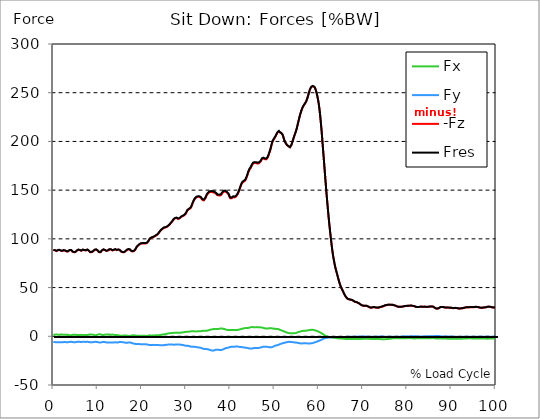
| Category |  Fx |  Fy |  -Fz |  Fres |
|---|---|---|---|---|
| 0.0 | 1.408 | -5.76 | 88.474 | 88.691 |
| 0.167348456675344 | 1.55 | -5.853 | 88.454 | 88.679 |
| 0.334696913350688 | 1.701 | -5.937 | 88.296 | 88.526 |
| 0.5020453700260321 | 1.839 | -6.049 | 87.878 | 88.12 |
| 0.669393826701376 | 1.946 | -6.173 | 87.444 | 87.696 |
| 0.83674228337672 | 1.825 | -6.201 | 87.62 | 87.871 |
| 1.0040907400520642 | 1.676 | -6.131 | 88.168 | 88.414 |
| 1.1621420602454444 | 1.561 | -6.025 | 88.717 | 88.954 |
| 1.3294905169207885 | 1.606 | -6.062 | 88.623 | 88.863 |
| 1.4968389735961325 | 1.676 | -6.101 | 88.382 | 88.628 |
| 1.6641874302714765 | 1.803 | -6.199 | 87.864 | 88.117 |
| 1.8315358869468206 | 1.916 | -6.334 | 87.353 | 87.617 |
| 1.9988843436221646 | 1.798 | -6.244 | 87.536 | 87.791 |
| 2.1662328002975086 | 1.658 | -6.104 | 87.871 | 88.115 |
| 2.333581256972853 | 1.53 | -5.922 | 88.278 | 88.507 |
| 2.5009297136481967 | 1.49 | -5.879 | 88.17 | 88.396 |
| 2.6682781703235405 | 1.498 | -5.937 | 87.878 | 88.107 |
| 2.8356266269988843 | 1.632 | -6.039 | 87.316 | 87.556 |
| 3.002975083674229 | 1.672 | -6.095 | 87.036 | 87.279 |
| 3.1703235403495724 | 1.593 | -6.07 | 86.97 | 87.209 |
| 3.337671997024917 | 1.49 | -6.048 | 87.148 | 87.383 |
| 3.4957233172182973 | 1.298 | -5.939 | 87.704 | 87.927 |
| 3.663071773893641 | 1.06 | -5.725 | 88.424 | 88.63 |
| 3.8304202305689854 | 0.971 | -5.603 | 88.649 | 88.847 |
| 3.997768687244329 | 1.015 | -5.607 | 88.474 | 88.673 |
| 4.165117143919673 | 1.247 | -5.717 | 87.768 | 87.977 |
| 4.332465600595017 | 1.511 | -5.905 | 86.878 | 87.105 |
| 4.499814057270361 | 1.693 | -6.076 | 86.191 | 86.437 |
| 4.667162513945706 | 1.663 | -6.104 | 86.224 | 86.471 |
| 4.834510970621049 | 1.608 | -6.013 | 86.352 | 86.591 |
| 5.001859427296393 | 1.69 | -6.034 | 86.444 | 86.684 |
| 5.169207883971737 | 1.556 | -5.939 | 86.976 | 87.206 |
| 5.336556340647081 | 1.329 | -5.776 | 87.956 | 88.172 |
| 5.503904797322425 | 1.3 | -5.669 | 88.561 | 88.77 |
| 5.671253253997769 | 1.298 | -5.642 | 88.84 | 89.046 |
| 5.82930457419115 | 1.312 | -5.648 | 88.819 | 89.025 |
| 5.996653030866494 | 1.399 | -5.743 | 88.3 | 88.514 |
| 6.164001487541838 | 1.515 | -5.905 | 87.666 | 87.894 |
| 6.331349944217181 | 1.486 | -5.945 | 87.774 | 88.003 |
| 6.498698400892526 | 1.323 | -5.822 | 88.245 | 88.462 |
| 6.66604685756787 | 1.111 | -5.624 | 88.825 | 89.026 |
| 6.833395314243213 | 1.233 | -5.651 | 88.755 | 88.958 |
| 7.000743770918558 | 1.403 | -5.719 | 88.378 | 88.588 |
| 7.168092227593902 | 1.473 | -5.782 | 87.957 | 88.173 |
| 7.335440684269246 | 1.404 | -5.757 | 88.122 | 88.336 |
| 7.50278914094459 | 1.323 | -5.709 | 88.581 | 88.79 |
| 7.6701375976199335 | 1.288 | -5.627 | 88.876 | 89.079 |
| 7.837486054295278 | 1.432 | -5.675 | 88.614 | 88.822 |
| 7.995537374488658 | 1.649 | -5.852 | 87.865 | 88.09 |
| 8.162885831164003 | 1.827 | -6.085 | 86.939 | 87.187 |
| 8.330234287839346 | 1.916 | -6.242 | 86.338 | 86.604 |
| 8.49758274451469 | 1.917 | -6.289 | 86.183 | 86.454 |
| 8.664931201190035 | 1.859 | -6.245 | 86.378 | 86.644 |
| 8.832279657865378 | 1.757 | -6.157 | 86.731 | 86.986 |
| 8.999628114540721 | 1.586 | -6.042 | 87.251 | 87.493 |
| 9.166976571216066 | 1.265 | -5.867 | 88.121 | 88.345 |
| 9.334325027891412 | 1.141 | -5.748 | 88.699 | 88.915 |
| 9.501673484566755 | 1.155 | -5.711 | 88.857 | 89.071 |
| 9.669021941242098 | 1.19 | -5.714 | 89.019 | 89.233 |
| 9.836370397917442 | 1.34 | -5.748 | 88.634 | 88.852 |
| 10.003718854592787 | 1.608 | -5.921 | 87.916 | 88.147 |
| 10.17106731126813 | 1.891 | -6.143 | 87.043 | 87.301 |
| 10.329118631461512 | 2.121 | -6.339 | 86.286 | 86.568 |
| 10.496467088136853 | 2.126 | -6.384 | 86.044 | 86.331 |
| 10.663815544812199 | 2.006 | -6.352 | 86.269 | 86.551 |
| 10.831164001487544 | 1.795 | -6.257 | 86.905 | 87.172 |
| 10.998512458162887 | 1.47 | -6.03 | 88.117 | 88.359 |
| 11.16586091483823 | 1.291 | -5.846 | 88.988 | 89.212 |
| 11.333209371513574 | 1.323 | -5.798 | 89.045 | 89.265 |
| 11.50055782818892 | 1.466 | -5.866 | 88.766 | 88.992 |
| 11.667906284864264 | 1.578 | -5.976 | 88.421 | 88.656 |
| 11.835254741539607 | 1.734 | -6.121 | 87.998 | 88.244 |
| 12.00260319821495 | 1.951 | -6.308 | 87.548 | 87.815 |
| 12.169951654890292 | 2.049 | -6.462 | 87.504 | 87.785 |
| 12.337300111565641 | 1.957 | -6.484 | 87.967 | 88.249 |
| 12.504648568240984 | 1.836 | -6.451 | 88.626 | 88.903 |
| 12.662699888434362 | 1.746 | -6.425 | 89.149 | 89.419 |
| 12.830048345109708 | 1.681 | -6.417 | 89.302 | 89.568 |
| 12.997396801785053 | 1.649 | -6.4 | 89.143 | 89.406 |
| 13.164745258460396 | 1.67 | -6.403 | 88.656 | 88.919 |
| 13.33209371513574 | 1.741 | -6.494 | 88.092 | 88.363 |
| 13.499442171811083 | 1.665 | -6.548 | 88.031 | 88.304 |
| 13.666790628486426 | 1.46 | -6.427 | 88.589 | 88.85 |
| 13.834139085161771 | 1.278 | -6.258 | 89.116 | 89.361 |
| 14.001487541837117 | 1.159 | -6.086 | 89.258 | 89.487 |
| 14.16883599851246 | 1.268 | -6.201 | 88.841 | 89.078 |
| 14.336184455187803 | 1.375 | -6.369 | 88.392 | 88.643 |
| 14.503532911863147 | 1.255 | -6.379 | 88.596 | 88.844 |
| 14.670881368538492 | 1.006 | -6.243 | 88.95 | 89.184 |
| 14.828932688731873 | 0.767 | -6.057 | 89.056 | 89.276 |
| 14.996281145407215 | 0.633 | -5.867 | 88.49 | 88.699 |
| 15.163629602082558 | 0.591 | -5.771 | 87.495 | 87.7 |
| 15.330978058757903 | 0.665 | -5.909 | 86.878 | 87.094 |
| 15.498326515433247 | 0.614 | -6.014 | 86.548 | 86.773 |
| 15.665674972108594 | 0.609 | -6.119 | 86.317 | 86.552 |
| 15.833023428783937 | 0.697 | -6.226 | 86.239 | 86.484 |
| 16.00037188545928 | 0.749 | -6.264 | 86.285 | 86.532 |
| 16.167720342134626 | 0.849 | -6.452 | 86.637 | 86.9 |
| 16.335068798809967 | 0.88 | -6.684 | 87.319 | 87.603 |
| 16.502417255485312 | 0.748 | -6.72 | 88.109 | 88.394 |
| 16.669765712160658 | 0.57 | -6.63 | 88.75 | 89.025 |
| 16.837114168836 | 0.449 | -6.589 | 89.061 | 89.329 |
| 17.004462625511344 | 0.256 | -6.42 | 89.299 | 89.552 |
| 17.16251394570472 | 0.228 | -6.361 | 89.163 | 89.411 |
| 17.32986240238007 | 0.223 | -6.302 | 88.937 | 89.181 |
| 17.497210859055414 | 0.409 | -6.421 | 88.261 | 88.514 |
| 17.664559315730756 | 0.717 | -6.748 | 87.253 | 87.529 |
| 17.8319077724061 | 0.963 | -7.126 | 86.956 | 87.269 |
| 17.999256229081443 | 1.009 | -7.375 | 87.069 | 87.405 |
| 18.166604685756788 | 0.941 | -7.456 | 87.414 | 87.756 |
| 18.333953142432133 | 0.912 | -7.643 | 87.849 | 88.207 |
| 18.501301599107478 | 0.842 | -7.763 | 88.657 | 89.024 |
| 18.668650055782823 | 0.776 | -7.899 | 89.94 | 90.314 |
| 18.835998512458165 | 0.613 | -7.986 | 91.532 | 91.905 |
| 19.00334696913351 | 0.466 | -7.938 | 92.529 | 92.893 |
| 19.170695425808855 | 0.403 | -7.919 | 93.044 | 93.403 |
| 19.338043882484197 | 0.429 | -7.986 | 93.52 | 93.884 |
| 19.496095202677576 | 0.434 | -8.066 | 94.472 | 94.839 |
| 19.66344365935292 | 0.443 | -8.109 | 95.074 | 95.443 |
| 19.830792116028263 | 0.437 | -8.099 | 95.193 | 95.561 |
| 19.998140572703612 | 0.41 | -8.078 | 95.219 | 95.586 |
| 20.165489029378953 | 0.463 | -8.113 | 95.264 | 95.634 |
| 20.3328374860543 | 0.511 | -8.148 | 95.302 | 95.676 |
| 20.500185942729644 | 0.493 | -8.193 | 95.244 | 95.62 |
| 20.667534399404985 | 0.476 | -8.237 | 95.187 | 95.563 |
| 20.83488285608033 | 0.397 | -8.254 | 95.274 | 95.651 |
| 21.002231312755672 | 0.328 | -8.278 | 95.403 | 95.777 |
| 21.16957976943102 | 0.373 | -8.371 | 95.783 | 96.164 |
| 21.336928226106362 | 0.451 | -8.512 | 96.42 | 96.812 |
| 21.504276682781704 | 0.761 | -8.811 | 97.546 | 97.963 |
| 21.67162513945705 | 0.946 | -8.944 | 98.996 | 99.419 |
| 21.82967645965043 | 0.958 | -8.92 | 100.057 | 100.471 |
| 21.997024916325774 | 0.91 | -8.888 | 100.625 | 101.032 |
| 22.16437337300112 | 0.943 | -8.884 | 101.083 | 101.489 |
| 22.33172182967646 | 0.937 | -8.849 | 101.363 | 101.765 |
| 22.499070286351806 | 0.809 | -8.777 | 101.55 | 101.942 |
| 22.666418743027148 | 0.853 | -8.799 | 101.815 | 102.209 |
| 22.833767199702496 | 0.936 | -8.93 | 102.299 | 102.704 |
| 23.00111565637784 | 0.946 | -8.98 | 102.909 | 103.315 |
| 23.168464113053183 | 0.934 | -8.929 | 103.273 | 103.672 |
| 23.335812569728528 | 0.94 | -8.925 | 103.651 | 104.049 |
| 23.50316102640387 | 1.001 | -8.96 | 104.195 | 104.596 |
| 23.670509483079215 | 1.043 | -9.004 | 104.946 | 105.35 |
| 23.83785793975456 | 1.12 | -9.128 | 105.983 | 106.394 |
| 23.995909259947936 | 1.177 | -9.094 | 107.102 | 107.509 |
| 24.163257716623285 | 1.23 | -9.089 | 108.042 | 108.445 |
| 24.330606173298627 | 1.389 | -9.125 | 108.809 | 109.217 |
| 24.49795462997397 | 1.621 | -9.191 | 109.668 | 110.083 |
| 24.665303086649313 | 1.802 | -9.206 | 110.178 | 110.595 |
| 24.83265154332466 | 1.945 | -9.182 | 110.729 | 111.143 |
| 25.0 | 2.027 | -9.099 | 111.301 | 111.709 |
| 25.167348456675345 | 2.111 | -9.012 | 111.449 | 111.849 |
| 25.334696913350694 | 2.232 | -8.901 | 111.623 | 112.017 |
| 25.502045370026035 | 2.398 | -8.757 | 111.829 | 112.214 |
| 25.669393826701377 | 2.587 | -8.623 | 112.268 | 112.647 |
| 25.836742283376722 | 2.788 | -8.505 | 112.78 | 113.155 |
| 26.004090740052067 | 2.976 | -8.545 | 113.45 | 113.832 |
| 26.17143919672741 | 3.054 | -8.492 | 113.984 | 114.363 |
| 26.329490516920792 | 3.116 | -8.45 | 114.78 | 115.156 |
| 26.49683897359613 | 3.193 | -8.416 | 115.844 | 116.217 |
| 26.66418743027148 | 3.304 | -8.401 | 116.802 | 117.175 |
| 26.831535886946828 | 3.291 | -8.427 | 117.6 | 117.971 |
| 26.998884343622166 | 3.419 | -8.551 | 118.616 | 118.996 |
| 27.166232800297514 | 3.515 | -8.582 | 119.716 | 120.099 |
| 27.333581256972852 | 3.608 | -8.62 | 120.522 | 120.907 |
| 27.5009297136482 | 3.598 | -8.562 | 121.066 | 121.445 |
| 27.668278170323543 | 3.612 | -8.484 | 121.506 | 121.878 |
| 27.835626626998888 | 3.627 | -8.417 | 121.494 | 121.861 |
| 28.002975083674233 | 3.644 | -8.465 | 121.022 | 121.395 |
| 28.170323540349575 | 3.527 | -8.486 | 120.537 | 120.911 |
| 28.33767199702492 | 3.496 | -8.448 | 120.633 | 121.004 |
| 28.50502045370026 | 3.632 | -8.505 | 120.884 | 121.263 |
| 28.663071773893645 | 3.61 | -8.509 | 121.51 | 121.889 |
| 28.830420230568986 | 3.773 | -8.681 | 122.207 | 122.603 |
| 28.99776868724433 | 3.91 | -8.837 | 122.999 | 123.409 |
| 29.165117143919673 | 3.986 | -8.895 | 123.254 | 123.672 |
| 29.33246560059502 | 4.057 | -9.026 | 123.555 | 123.988 |
| 29.499814057270367 | 4.143 | -9.191 | 123.907 | 124.358 |
| 29.66716251394571 | 4.347 | -9.44 | 124.493 | 124.982 |
| 29.834510970621054 | 4.52 | -9.662 | 125.198 | 125.72 |
| 30.00185942729639 | 4.57 | -9.74 | 126.441 | 126.972 |
| 30.169207883971744 | 4.553 | -9.653 | 128.01 | 128.533 |
| 30.33655634064708 | 4.57 | -9.617 | 129.348 | 129.868 |
| 30.50390479732243 | 4.698 | -9.809 | 129.988 | 130.526 |
| 30.671253253997772 | 4.806 | -10.064 | 130.398 | 130.965 |
| 30.829304574191156 | 4.914 | -10.318 | 130.808 | 131.403 |
| 30.996653030866494 | 5.003 | -10.49 | 131.446 | 132.059 |
| 31.164001487541842 | 5.136 | -10.699 | 132.666 | 133.294 |
| 31.331349944217187 | 5.222 | -10.811 | 134.558 | 135.191 |
| 31.498698400892525 | 5.204 | -10.811 | 136.596 | 137.218 |
| 31.666046857567874 | 5.139 | -10.762 | 138.316 | 138.927 |
| 31.833395314243212 | 5.093 | -10.77 | 139.824 | 140.428 |
| 32.00074377091856 | 5.06 | -10.839 | 141.08 | 141.682 |
| 32.1680922275939 | 5.003 | -10.93 | 141.956 | 142.562 |
| 32.33544068426925 | 5.015 | -11.071 | 142.539 | 143.156 |
| 32.50278914094459 | 5.068 | -11.206 | 142.915 | 143.543 |
| 32.670137597619934 | 5.104 | -11.36 | 143.183 | 143.82 |
| 32.83748605429528 | 5.084 | -11.427 | 143.314 | 143.952 |
| 33.004834510970625 | 5.161 | -11.583 | 143.016 | 143.665 |
| 33.162885831164004 | 5.202 | -11.717 | 142.691 | 143.357 |
| 33.33023428783935 | 5.242 | -11.865 | 142.276 | 142.961 |
| 33.497582744514695 | 5.358 | -12.136 | 141.422 | 142.134 |
| 33.664931201190036 | 5.529 | -12.445 | 140.15 | 140.892 |
| 33.83227965786538 | 5.675 | -12.737 | 139.2 | 139.975 |
| 33.99962811454073 | 5.715 | -12.921 | 139.432 | 140.23 |
| 34.16697657121607 | 5.712 | -12.989 | 140.246 | 141.052 |
| 34.33432502789141 | 5.71 | -13.058 | 141.243 | 142.054 |
| 34.50167348456676 | 5.695 | -13.073 | 142.843 | 143.652 |
| 34.6690219412421 | 5.657 | -13.068 | 144.681 | 145.488 |
| 34.83637039791744 | 5.824 | -13.239 | 145.82 | 146.646 |
| 35.00371885459279 | 6.079 | -13.475 | 146.819 | 147.671 |
| 35.17106731126814 | 6.317 | -13.655 | 147.51 | 148.384 |
| 35.338415767943474 | 6.504 | -13.819 | 147.832 | 148.726 |
| 35.49646708813686 | 6.683 | -14.091 | 148.027 | 148.956 |
| 35.6638155448122 | 6.948 | -14.394 | 148.115 | 149.088 |
| 35.831164001487544 | 7.13 | -14.637 | 148.061 | 149.073 |
| 35.998512458162885 | 7.279 | -14.722 | 147.945 | 148.978 |
| 36.165860914838234 | 7.416 | -14.647 | 147.805 | 148.84 |
| 36.333209371513576 | 7.494 | -14.515 | 147.458 | 148.488 |
| 36.50055782818892 | 7.485 | -14.27 | 147.14 | 148.147 |
| 36.667906284864266 | 7.337 | -13.844 | 146.948 | 147.899 |
| 36.83525474153961 | 7.314 | -13.788 | 146.081 | 147.018 |
| 37.002603198214956 | 7.427 | -13.852 | 145.047 | 145.999 |
| 37.1699516548903 | 7.573 | -13.93 | 144.315 | 145.285 |
| 37.337300111565646 | 7.553 | -13.842 | 144.637 | 145.596 |
| 37.50464856824098 | 7.648 | -13.883 | 144.647 | 145.618 |
| 37.66269988843437 | 7.84 | -14.043 | 144.386 | 145.388 |
| 37.83004834510971 | 8.002 | -14.137 | 144.565 | 145.59 |
| 37.99739680178505 | 8.126 | -14.102 | 145.298 | 146.327 |
| 38.16474525846039 | 7.942 | -13.783 | 146.739 | 147.755 |
| 38.33209371513574 | 7.758 | -13.518 | 147.716 | 148.71 |
| 38.49944217181109 | 7.641 | -13.245 | 148.256 | 149.217 |
| 38.666790628486424 | 7.479 | -12.839 | 148.655 | 149.573 |
| 38.83413908516178 | 7.152 | -12.46 | 148.7 | 149.571 |
| 39.001487541837115 | 6.852 | -12.104 | 148.409 | 149.247 |
| 39.16883599851246 | 6.671 | -11.95 | 147.695 | 148.522 |
| 39.336184455187805 | 6.581 | -11.895 | 146.963 | 147.785 |
| 39.503532911863154 | 6.49 | -11.741 | 146.265 | 147.08 |
| 39.670881368538495 | 6.361 | -11.481 | 145.19 | 145.994 |
| 39.83822982521384 | 6.397 | -11.191 | 142.972 | 143.777 |
| 39.996281145407224 | 6.338 | -10.955 | 141.68 | 142.486 |
| 40.163629602082565 | 6.363 | -10.814 | 141.314 | 142.132 |
| 40.33097805875791 | 6.4 | -10.768 | 141.672 | 142.496 |
| 40.498326515433256 | 6.381 | -10.664 | 142.422 | 143.235 |
| 40.6656749721086 | 6.381 | -10.625 | 142.905 | 143.721 |
| 40.83302342878393 | 6.401 | -10.658 | 142.614 | 143.446 |
| 41.00037188545929 | 6.443 | -10.67 | 142.532 | 143.378 |
| 41.16772034213463 | 6.43 | -10.605 | 142.843 | 143.696 |
| 41.33506879880997 | 6.368 | -10.474 | 143.555 | 144.409 |
| 41.50241725548531 | 6.356 | -10.403 | 144.474 | 145.322 |
| 41.66976571216066 | 6.483 | -10.522 | 145.74 | 146.595 |
| 41.837114168836 | 6.699 | -10.655 | 147.377 | 148.243 |
| 42.004462625511344 | 6.894 | -10.828 | 149.284 | 150.15 |
| 42.17181108218669 | 7.101 | -10.998 | 151.381 | 152.244 |
| 42.32986240238007 | 7.272 | -11.044 | 153.638 | 154.493 |
| 42.497210859055414 | 7.433 | -11.026 | 155.645 | 156.49 |
| 42.66455931573076 | 7.654 | -11.151 | 157.279 | 158.125 |
| 42.831907772406105 | 7.9 | -11.293 | 158.261 | 159.122 |
| 42.999256229081446 | 8.13 | -11.401 | 158.573 | 159.457 |
| 43.16660468575679 | 8.263 | -11.42 | 158.929 | 159.824 |
| 43.33395314243214 | 8.39 | -11.547 | 159.624 | 160.534 |
| 43.50130159910748 | 8.464 | -11.731 | 160.886 | 161.805 |
| 43.66865005578282 | 8.453 | -11.85 | 162.687 | 163.6 |
| 43.83599851245817 | 8.476 | -11.945 | 164.725 | 165.635 |
| 44.00334696913351 | 8.572 | -12.136 | 167.191 | 168.112 |
| 44.17069542580886 | 8.679 | -12.394 | 169.389 | 170.32 |
| 44.3380438824842 | 8.844 | -12.54 | 170.911 | 171.856 |
| 44.49609520267758 | 9.194 | -12.788 | 171.619 | 172.627 |
| 44.66344365935292 | 9.388 | -12.676 | 173.037 | 174.037 |
| 44.83079211602827 | 9.437 | -12.534 | 174.857 | 175.837 |
| 44.99814057270361 | 9.438 | -12.48 | 176.206 | 177.18 |
| 45.16548902937895 | 9.352 | -12.316 | 177.342 | 178.295 |
| 45.332837486054295 | 9.268 | -12.106 | 177.787 | 178.719 |
| 45.500185942729644 | 9.285 | -12.004 | 177.838 | 178.759 |
| 45.66753439940499 | 9.286 | -12.061 | 177.975 | 178.898 |
| 45.83488285608033 | 9.354 | -12.085 | 177.77 | 178.701 |
| 46.00223131275568 | 9.43 | -12.044 | 177.412 | 178.35 |
| 46.16957976943102 | 9.323 | -12.025 | 177.295 | 178.222 |
| 46.336928226106366 | 9.216 | -12.007 | 177.18 | 178.093 |
| 46.50427668278171 | 9.196 | -11.991 | 177.604 | 178.517 |
| 46.671625139457056 | 9.182 | -11.673 | 178.596 | 179.467 |
| 46.829676459650436 | 9.216 | -11.562 | 179.107 | 179.972 |
| 46.99702491632577 | 9.115 | -11.429 | 180.44 | 181.295 |
| 47.16437337300112 | 8.944 | -11.084 | 181.858 | 182.679 |
| 47.33172182967646 | 8.808 | -10.838 | 182.437 | 183.23 |
| 47.49907028635181 | 8.739 | -10.737 | 182.572 | 183.352 |
| 47.66641874302716 | 8.421 | -10.716 | 181.755 | 182.514 |
| 47.83376719970249 | 8.152 | -10.847 | 181.693 | 182.449 |
| 48.001115656377834 | 7.888 | -10.75 | 181.46 | 182.197 |
| 48.16846411305319 | 7.796 | -10.724 | 181.732 | 182.454 |
| 48.33581256972853 | 7.881 | -10.799 | 182.413 | 183.153 |
| 48.50316102640387 | 8.033 | -10.958 | 183.787 | 184.56 |
| 48.67050948307921 | 8.153 | -11.097 | 185.92 | 186.712 |
| 48.837857939754564 | 8.297 | -11.252 | 188.096 | 188.905 |
| 49.005206396429905 | 8.39 | -11.374 | 190.222 | 191.035 |
| 49.163257716623285 | 8.375 | -11.391 | 192.995 | 193.794 |
| 49.33060617329863 | 8.225 | -11.187 | 196.202 | 196.954 |
| 49.49795462997397 | 8.051 | -10.978 | 198.924 | 199.632 |
| 49.66530308664932 | 7.911 | -10.779 | 200.788 | 201.464 |
| 49.832651543324666 | 7.827 | -10.356 | 201.736 | 202.371 |
| 50.0 | 7.763 | -9.899 | 203.229 | 203.815 |
| 50.16734845667534 | 7.685 | -9.641 | 204.539 | 205.09 |
| 50.33469691335069 | 7.593 | -9.413 | 205.929 | 206.448 |
| 50.50204537002604 | 7.485 | -9.278 | 207.551 | 208.05 |
| 50.66939382670139 | 7.476 | -9.09 | 208.977 | 209.456 |
| 50.836742283376715 | 7.347 | -8.783 | 210.007 | 210.447 |
| 51.00409074005207 | 7.242 | -8.558 | 210.362 | 210.768 |
| 51.17143919672741 | 6.819 | -8.208 | 209.357 | 209.724 |
| 51.32949051692079 | 6.357 | -7.899 | 208.644 | 208.976 |
| 51.496838973596134 | 6.081 | -7.616 | 208.602 | 208.911 |
| 51.66418743027148 | 5.924 | -7.389 | 208.076 | 208.368 |
| 51.831535886946824 | 5.634 | -7.141 | 206.814 | 207.087 |
| 51.99888434362217 | 5.311 | -6.939 | 204.507 | 204.756 |
| 52.16623280029752 | 4.992 | -6.768 | 201.739 | 201.963 |
| 52.33358125697285 | 4.687 | -6.611 | 199.943 | 200.151 |
| 52.5009297136482 | 4.31 | -6.329 | 198.431 | 198.611 |
| 52.668278170323546 | 4.043 | -6.163 | 197.458 | 197.623 |
| 52.835626626998895 | 3.755 | -6.049 | 196.129 | 196.284 |
| 53.00297508367424 | 3.524 | -5.832 | 195.465 | 195.61 |
| 53.17032354034958 | 3.325 | -5.582 | 195.106 | 195.244 |
| 53.33767199702492 | 3.244 | -5.668 | 194.439 | 194.575 |
| 53.50502045370027 | 3.216 | -5.822 | 193.994 | 194.13 |
| 53.663071773893655 | 3.074 | -5.839 | 194.844 | 194.972 |
| 53.83042023056899 | 3.036 | -5.94 | 196.396 | 196.523 |
| 53.99776868724433 | 3.036 | -5.943 | 198.781 | 198.906 |
| 54.16511714391967 | 3.027 | -6.055 | 201.184 | 201.311 |
| 54.33246560059503 | 3.018 | -6.166 | 203.589 | 203.715 |
| 54.49981405727037 | 3.06 | -6.301 | 205.901 | 206.03 |
| 54.667162513945705 | 3.201 | -6.444 | 208.053 | 208.188 |
| 54.834510970621054 | 3.378 | -6.454 | 210.207 | 210.342 |
| 55.0018594272964 | 3.567 | -6.509 | 212.7 | 212.838 |
| 55.169207883971744 | 3.857 | -6.669 | 215.788 | 215.934 |
| 55.336556340647086 | 4.273 | -6.888 | 219.022 | 219.178 |
| 55.50390479732243 | 4.458 | -6.983 | 222.103 | 222.264 |
| 55.671253253997776 | 4.681 | -7.127 | 225.156 | 225.324 |
| 55.83860171067312 | 4.974 | -7.255 | 227.938 | 228.115 |
| 55.9966530308665 | 5.168 | -7.289 | 230.423 | 230.605 |
| 56.16400148754184 | 5.309 | -7.295 | 232.691 | 232.875 |
| 56.33134994421718 | 5.483 | -7.291 | 234.716 | 234.902 |
| 56.498698400892536 | 5.546 | -7.242 | 236.145 | 236.33 |
| 56.66604685756788 | 5.599 | -7.224 | 237.333 | 237.518 |
| 56.83339531424321 | 5.619 | -7.203 | 238.491 | 238.675 |
| 57.00074377091856 | 5.639 | -7.181 | 239.649 | 239.833 |
| 57.16809222759391 | 5.673 | -7.168 | 240.94 | 241.124 |
| 57.33544068426925 | 5.877 | -7.27 | 242.98 | 243.17 |
| 57.5027891409446 | 6.078 | -7.382 | 245.31 | 245.508 |
| 57.670137597619934 | 6.246 | -7.407 | 247.915 | 248.116 |
| 57.83748605429528 | 6.381 | -7.36 | 250.676 | 250.879 |
| 58.004834510970625 | 6.475 | -7.341 | 252.892 | 253.095 |
| 58.16288583116401 | 6.53 | -7.264 | 254.742 | 254.943 |
| 58.330234287839346 | 6.633 | -7.2 | 255.934 | 256.134 |
| 58.497582744514695 | 6.68 | -7.122 | 256.512 | 256.71 |
| 58.66493120119004 | 6.644 | -6.971 | 256.749 | 256.942 |
| 58.832279657865385 | 6.53 | -6.705 | 256.655 | 256.839 |
| 58.999628114540734 | 6.307 | -6.377 | 255.984 | 256.156 |
| 59.16697657121607 | 6.086 | -6.099 | 254.731 | 254.892 |
| 59.33432502789142 | 5.879 | -5.868 | 252.638 | 252.791 |
| 59.50167348456676 | 5.635 | -5.618 | 250.122 | 250.266 |
| 59.66902194124211 | 5.331 | -5.323 | 246.872 | 247.001 |
| 59.83637039791745 | 4.978 | -5.03 | 243.02 | 243.138 |
| 60.00371885459278 | 4.68 | -4.76 | 238.745 | 238.852 |
| 60.17106731126813 | 4.328 | -4.448 | 233.076 | 233.173 |
| 60.33841576794349 | 3.958 | -4.09 | 226.319 | 226.404 |
| 60.49646708813685 | 3.576 | -3.78 | 218.352 | 218.428 |
| 60.6638155448122 | 3.107 | -3.43 | 209.786 | 209.852 |
| 60.831164001487544 | 2.609 | -3.066 | 200.29 | 200.347 |
| 60.99851245816289 | 2.037 | -2.62 | 190.42 | 190.466 |
| 61.16586091483824 | 1.495 | -2.26 | 180.889 | 180.93 |
| 61.333209371513576 | 0.986 | -1.986 | 171.119 | 171.153 |
| 61.50055782818892 | 0.578 | -1.784 | 161.331 | 161.362 |
| 61.667906284864266 | 0.22 | -1.623 | 151.811 | 151.838 |
| 61.835254741539615 | -0.08 | -1.518 | 142.776 | 142.802 |
| 62.002603198214956 | -0.297 | -1.463 | 134.096 | 134.122 |
| 62.16995165489029 | -0.557 | -1.352 | 125.678 | 125.704 |
| 62.33730011156564 | -0.751 | -1.251 | 117.844 | 117.873 |
| 62.504648568240995 | -0.902 | -1.124 | 110.55 | 110.582 |
| 62.67199702491633 | -1.06 | -0.974 | 103.637 | 103.67 |
| 62.83004834510971 | -1.219 | -0.902 | 96.963 | 96.998 |
| 62.99739680178505 | -1.342 | -0.869 | 90.748 | 90.787 |
| 63.1647452584604 | -1.433 | -0.849 | 85.077 | 85.119 |
| 63.33209371513575 | -1.494 | -0.85 | 80.442 | 80.488 |
| 63.4994421718111 | -1.49 | -0.929 | 76.318 | 76.362 |
| 63.666790628486424 | -1.529 | -0.946 | 72.437 | 72.476 |
| 63.83413908516177 | -1.69 | -0.85 | 69.245 | 69.283 |
| 64.00148754183712 | -1.886 | -0.75 | 66.418 | 66.458 |
| 64.16883599851248 | -2.052 | -0.679 | 63.633 | 63.675 |
| 64.3361844551878 | -2.127 | -0.669 | 60.629 | 60.676 |
| 64.50353291186315 | -2.171 | -0.634 | 57.867 | 57.916 |
| 64.6708813685385 | -2.168 | -0.664 | 55.201 | 55.253 |
| 64.83822982521384 | -2.36 | -0.611 | 52.891 | 52.954 |
| 65.00557828188919 | -2.416 | -0.617 | 50.794 | 50.862 |
| 65.16362960208257 | -2.384 | -0.64 | 49.016 | 49.086 |
| 65.3309780587579 | -2.336 | -0.775 | 47.534 | 47.607 |
| 65.49832651543326 | -2.455 | -0.698 | 46.123 | 46.206 |
| 65.6656749721086 | -2.54 | -0.664 | 44.309 | 44.399 |
| 65.83302342878395 | -2.587 | -0.688 | 42.737 | 42.834 |
| 66.00037188545929 | -2.688 | -0.657 | 41.464 | 41.569 |
| 66.16772034213463 | -2.741 | -0.647 | 40.263 | 40.376 |
| 66.33506879880998 | -2.768 | -0.622 | 39.259 | 39.378 |
| 66.50241725548531 | -2.791 | -0.578 | 38.537 | 38.66 |
| 66.66976571216065 | -2.787 | -0.588 | 38.183 | 38.307 |
| 66.83711416883601 | -2.77 | -0.592 | 37.899 | 38.022 |
| 67.00446262551135 | -2.743 | -0.592 | 37.67 | 37.794 |
| 67.1718110821867 | -2.75 | -0.548 | 37.534 | 37.657 |
| 67.32986240238007 | -2.763 | -0.502 | 37.415 | 37.538 |
| 67.49721085905541 | -2.761 | -0.486 | 37.272 | 37.396 |
| 67.66455931573076 | -2.755 | -0.474 | 37.017 | 37.141 |
| 67.83190777240611 | -2.739 | -0.471 | 36.414 | 36.539 |
| 67.99925622908145 | -2.741 | -0.458 | 35.842 | 35.968 |
| 68.16660468575678 | -2.725 | -0.43 | 35.415 | 35.541 |
| 68.33395314243214 | -2.664 | -0.396 | 35.258 | 35.38 |
| 68.50130159910749 | -2.663 | -0.404 | 35.06 | 35.184 |
| 68.66865005578282 | -2.668 | -0.383 | 34.748 | 34.873 |
| 68.83599851245816 | -2.673 | -0.358 | 34.412 | 34.539 |
| 69.00334696913352 | -2.673 | -0.336 | 34.09 | 34.217 |
| 69.17069542580886 | -2.664 | -0.341 | 33.581 | 33.709 |
| 69.3380438824842 | -2.654 | -0.355 | 33.002 | 33.131 |
| 69.50539233915956 | -2.673 | -0.363 | 32.408 | 32.539 |
| 69.66344365935292 | -2.687 | -0.356 | 31.902 | 32.034 |
| 69.83079211602826 | -2.685 | -0.305 | 31.639 | 31.77 |
| 69.99814057270362 | -2.636 | -0.301 | 31.439 | 31.565 |
| 70.16548902937896 | -2.592 | -0.29 | 31.276 | 31.396 |
| 70.33283748605429 | -2.553 | -0.275 | 31.249 | 31.364 |
| 70.50018594272964 | -2.489 | -0.317 | 31.292 | 31.404 |
| 70.667534399405 | -2.512 | -0.317 | 31.322 | 31.438 |
| 70.83488285608033 | -2.574 | -0.335 | 31.218 | 31.341 |
| 71.00223131275568 | -2.588 | -0.401 | 30.912 | 31.04 |
| 71.16957976943102 | -2.583 | -0.473 | 30.489 | 30.62 |
| 71.33692822610637 | -2.623 | -0.464 | 30.082 | 30.219 |
| 71.50427668278171 | -2.661 | -0.455 | 29.674 | 29.817 |
| 71.67162513945706 | -2.705 | -0.459 | 29.455 | 29.603 |
| 71.8389735961324 | -2.748 | -0.464 | 29.273 | 29.427 |
| 71.99702491632577 | -2.796 | -0.455 | 29.347 | 29.506 |
| 72.16437337300113 | -2.832 | -0.449 | 29.658 | 29.819 |
| 72.33172182967647 | -2.838 | -0.466 | 29.916 | 30.078 |
| 72.49907028635181 | -2.842 | -0.462 | 29.936 | 30.099 |
| 72.66641874302715 | -2.801 | -0.505 | 29.693 | 29.856 |
| 72.8337671997025 | -2.691 | -0.585 | 29.505 | 29.655 |
| 73.00111565637783 | -2.702 | -0.502 | 29.477 | 29.629 |
| 73.16846411305319 | -2.759 | -0.452 | 29.398 | 29.559 |
| 73.33581256972853 | -2.797 | -0.404 | 29.333 | 29.5 |
| 73.50316102640387 | -2.781 | -0.365 | 29.306 | 29.474 |
| 73.67050948307921 | -2.828 | -0.324 | 29.473 | 29.645 |
| 73.83785793975457 | -2.882 | -0.309 | 29.799 | 29.977 |
| 74.00520639642991 | -2.92 | -0.301 | 30.1 | 30.281 |
| 74.16325771662328 | -2.902 | -0.279 | 30.264 | 30.441 |
| 74.33060617329863 | -2.919 | -0.288 | 30.423 | 30.603 |
| 74.49795462997398 | -2.977 | -0.332 | 30.634 | 30.82 |
| 74.66530308664932 | -2.95 | -0.399 | 30.996 | 31.178 |
| 74.83265154332466 | -2.963 | -0.409 | 31.352 | 31.537 |
| 75.00000000000001 | -2.961 | -0.43 | 31.669 | 31.857 |
| 75.16734845667534 | -2.868 | -0.493 | 31.83 | 31.999 |
| 75.3346969133507 | -2.858 | -0.464 | 31.884 | 32.05 |
| 75.50204537002605 | -2.821 | -0.455 | 32.089 | 32.25 |
| 75.66939382670138 | -2.727 | -0.435 | 32.46 | 32.603 |
| 75.83674228337672 | -2.674 | -0.488 | 32.406 | 32.545 |
| 76.00409074005208 | -2.619 | -0.54 | 32.351 | 32.488 |
| 76.17143919672742 | -2.55 | -0.551 | 32.261 | 32.39 |
| 76.33878765340276 | -2.448 | -0.608 | 32.3 | 32.419 |
| 76.49683897359614 | -2.261 | -0.607 | 32.397 | 32.496 |
| 76.66418743027148 | -2.137 | -0.533 | 32.414 | 32.505 |
| 76.83153588694682 | -2.043 | -0.556 | 32.163 | 32.248 |
| 76.99888434362218 | -2.004 | -0.598 | 31.662 | 31.746 |
| 77.16623280029752 | -2.022 | -0.558 | 31.645 | 31.731 |
| 77.33358125697285 | -2.016 | -0.541 | 31.71 | 31.797 |
| 77.5009297136482 | -1.973 | -0.618 | 31.135 | 31.225 |
| 77.66827817032356 | -2.021 | -0.543 | 30.757 | 30.851 |
| 77.83562662699889 | -2.066 | -0.541 | 30.348 | 30.448 |
| 78.00297508367423 | -2.062 | -0.513 | 30.237 | 30.339 |
| 78.17032354034959 | -2.06 | -0.445 | 30.219 | 30.322 |
| 78.33767199702493 | -2.059 | -0.378 | 30.202 | 30.305 |
| 78.50502045370027 | -2.06 | -0.335 | 30.217 | 30.321 |
| 78.67236891037561 | -2.062 | -0.311 | 30.259 | 30.366 |
| 78.83042023056899 | -2.085 | -0.263 | 30.339 | 30.445 |
| 78.99776868724433 | -2.116 | -0.205 | 30.431 | 30.541 |
| 79.16511714391969 | -2.104 | -0.174 | 30.633 | 30.741 |
| 79.33246560059503 | -2.041 | -0.194 | 30.921 | 31.023 |
| 79.49981405727036 | -1.969 | -0.172 | 30.971 | 31.071 |
| 79.66716251394571 | -1.924 | -0.093 | 31.044 | 31.146 |
| 79.83451097062107 | -1.902 | 0.002 | 31.152 | 31.253 |
| 80.00185942729641 | -1.894 | -0.027 | 31.161 | 31.259 |
| 80.16920788397174 | -1.866 | -0.115 | 31.233 | 31.321 |
| 80.33655634064709 | -1.824 | -0.226 | 31.365 | 31.445 |
| 80.50390479732243 | -1.877 | -0.174 | 31.345 | 31.427 |
| 80.67125325399778 | -1.88 | -0.113 | 31.417 | 31.5 |
| 80.83860171067312 | -1.928 | -0.06 | 31.519 | 31.608 |
| 80.99665303086651 | -2.018 | 0.037 | 31.354 | 31.452 |
| 81.16400148754184 | -2.075 | 0.088 | 31.243 | 31.347 |
| 81.3313499442172 | -2.147 | 0.102 | 31.25 | 31.357 |
| 81.49869840089255 | -2.137 | 0.043 | 31.025 | 31.129 |
| 81.66604685756786 | -2.186 | 0.032 | 30.75 | 30.858 |
| 81.83339531424322 | -2.178 | 0.009 | 30.417 | 30.522 |
| 82.00074377091858 | -2.081 | -0.088 | 30.001 | 30.094 |
| 82.16809222759392 | -2.072 | -0.117 | 29.945 | 30.037 |
| 82.33544068426926 | -2.062 | -0.155 | 29.962 | 30.054 |
| 82.50278914094459 | -2.039 | -0.215 | 29.984 | 30.075 |
| 82.67013759761994 | -2.04 | -0.246 | 30.196 | 30.285 |
| 82.83748605429528 | -1.996 | -0.222 | 30.145 | 30.228 |
| 83.00483451097062 | -2.002 | -0.216 | 30.202 | 30.286 |
| 83.17218296764597 | -2.002 | -0.174 | 30.468 | 30.553 |
| 83.33023428783935 | -1.97 | -0.222 | 30.259 | 30.346 |
| 83.4975827445147 | -2 | -0.189 | 30.122 | 30.214 |
| 83.66493120119004 | -1.955 | -0.157 | 30.28 | 30.369 |
| 83.83227965786537 | -1.93 | -0.151 | 30.378 | 30.468 |
| 83.99962811454073 | -1.948 | -0.129 | 30.375 | 30.469 |
| 84.16697657121607 | -1.956 | -0.135 | 30.186 | 30.28 |
| 84.33432502789142 | -1.97 | -0.07 | 30.29 | 30.383 |
| 84.50167348456677 | -1.952 | -0.054 | 30.098 | 30.186 |
| 84.6690219412421 | -1.927 | -0.066 | 30.059 | 30.145 |
| 84.83637039791745 | -1.904 | -0.076 | 30.244 | 30.329 |
| 85.0037188545928 | -1.909 | -0.094 | 30.438 | 30.523 |
| 85.17106731126813 | -1.886 | -0.103 | 30.547 | 30.632 |
| 85.33841576794349 | -1.91 | -0.045 | 30.648 | 30.731 |
| 85.50576422461883 | -1.838 | -0.104 | 30.597 | 30.675 |
| 85.66381554481221 | -1.83 | -0.07 | 30.492 | 30.57 |
| 85.83116400148755 | -1.859 | 0.016 | 30.441 | 30.52 |
| 85.99851245816289 | -1.88 | 0.043 | 29.978 | 30.058 |
| 86.16586091483823 | -2.03 | 0.276 | 29.458 | 29.555 |
| 86.33320937151358 | -2.178 | 0.371 | 29.009 | 29.124 |
| 86.50055782818893 | -2.235 | 0.357 | 28.555 | 28.671 |
| 86.66790628486427 | -2.312 | 0.295 | 28.31 | 28.433 |
| 86.83525474153961 | -2.35 | 0.268 | 28.305 | 28.43 |
| 87.00260319821496 | -2.376 | 0.289 | 28.464 | 28.589 |
| 87.16995165489031 | -2.35 | 0.245 | 28.822 | 28.942 |
| 87.33730011156564 | -2.29 | 0.1 | 29.413 | 29.519 |
| 87.504648568241 | -2.274 | -0.03 | 29.88 | 29.984 |
| 87.67199702491634 | -2.306 | -0.085 | 30.03 | 30.137 |
| 87.83004834510972 | -2.305 | -0.185 | 29.984 | 30.093 |
| 87.99739680178506 | -2.308 | -0.207 | 29.94 | 30.05 |
| 88.1647452584604 | -2.308 | -0.189 | 29.909 | 30.019 |
| 88.33209371513574 | -2.252 | -0.248 | 29.743 | 29.848 |
| 88.49944217181108 | -2.23 | -0.255 | 29.568 | 29.672 |
| 88.66679062848644 | -2.288 | -0.261 | 29.477 | 29.584 |
| 88.83413908516178 | -2.348 | -0.281 | 29.381 | 29.491 |
| 89.00148754183712 | -2.422 | -0.285 | 29.522 | 29.639 |
| 89.16883599851246 | -2.447 | -0.31 | 29.507 | 29.627 |
| 89.33618445518782 | -2.441 | -0.342 | 29.388 | 29.51 |
| 89.50353291186315 | -2.475 | -0.332 | 29.276 | 29.403 |
| 89.6708813685385 | -2.53 | -0.317 | 29.22 | 29.353 |
| 89.83822982521386 | -2.571 | -0.338 | 29.286 | 29.425 |
| 90.00557828188919 | -2.574 | -0.335 | 29.307 | 29.449 |
| 90.16362960208257 | -2.615 | -0.359 | 29.003 | 29.153 |
| 90.3309780587579 | -2.592 | -0.41 | 28.792 | 28.944 |
| 90.49832651543326 | -2.592 | -0.393 | 28.782 | 28.934 |
| 90.66567497210859 | -2.486 | -0.481 | 28.895 | 29.033 |
| 90.83302342878395 | -2.45 | -0.489 | 29.086 | 29.217 |
| 91.00037188545929 | -2.455 | -0.529 | 29.026 | 29.159 |
| 91.16772034213463 | -2.48 | -0.565 | 28.923 | 29.061 |
| 91.33506879880998 | -2.502 | -0.605 | 28.82 | 28.964 |
| 91.50241725548533 | -2.512 | -0.646 | 28.57 | 28.719 |
| 91.66976571216065 | -2.519 | -0.668 | 28.337 | 28.49 |
| 91.83711416883601 | -2.524 | -0.636 | 28.376 | 28.527 |
| 92.00446262551137 | -2.527 | -0.591 | 28.533 | 28.68 |
| 92.1718110821867 | -2.521 | -0.552 | 28.614 | 28.756 |
| 92.33915953886203 | -2.471 | -0.52 | 28.658 | 28.792 |
| 92.49721085905541 | -2.42 | -0.475 | 28.707 | 28.834 |
| 92.66455931573077 | -2.358 | -0.459 | 28.837 | 28.955 |
| 92.83190777240611 | -2.253 | -0.486 | 29.179 | 29.284 |
| 92.99925622908145 | -2.168 | -0.473 | 29.419 | 29.516 |
| 93.1666046857568 | -2.13 | -0.46 | 29.518 | 29.611 |
| 93.33395314243214 | -2.161 | -0.41 | 29.672 | 29.767 |
| 93.50130159910749 | -2.183 | -0.372 | 29.794 | 29.89 |
| 93.66865005578283 | -2.171 | -0.383 | 29.757 | 29.853 |
| 93.83599851245818 | -2.156 | -0.37 | 29.663 | 29.758 |
| 94.00334696913353 | -2.105 | -0.351 | 29.868 | 29.958 |
| 94.17069542580886 | -2.062 | -0.357 | 29.888 | 29.976 |
| 94.3380438824842 | -2.083 | -0.382 | 29.822 | 29.912 |
| 94.50539233915954 | -2.146 | -0.384 | 29.877 | 29.975 |
| 94.66344365935292 | -2.22 | -0.394 | 29.848 | 29.952 |
| 94.83079211602828 | -2.22 | -0.451 | 29.914 | 30.017 |
| 94.99814057270362 | -2.223 | -0.476 | 29.877 | 29.982 |
| 95.16548902937897 | -2.237 | -0.466 | 29.85 | 29.957 |
| 95.33283748605432 | -2.256 | -0.451 | 29.962 | 30.069 |
| 95.50018594272963 | -2.278 | -0.434 | 30.219 | 30.325 |
| 95.66753439940499 | -2.298 | -0.424 | 30.181 | 30.287 |
| 95.83488285608034 | -2.315 | -0.444 | 29.999 | 30.109 |
| 96.00223131275567 | -2.29 | -0.455 | 29.886 | 29.992 |
| 96.16957976943102 | -2.274 | -0.464 | 29.753 | 29.859 |
| 96.33692822610638 | -2.327 | -0.413 | 29.515 | 29.627 |
| 96.50427668278171 | -2.312 | -0.435 | 29.325 | 29.438 |
| 96.67162513945706 | -2.302 | -0.447 | 29.253 | 29.366 |
| 96.8389735961324 | -2.368 | -0.413 | 29.136 | 29.253 |
| 96.99702491632577 | -2.401 | -0.382 | 29.375 | 29.493 |
| 97.16437337300111 | -2.369 | -0.388 | 29.461 | 29.575 |
| 97.33172182967647 | -2.339 | -0.399 | 29.534 | 29.644 |
| 97.49907028635181 | -2.317 | -0.427 | 29.57 | 29.681 |
| 97.66641874302715 | -2.33 | -0.443 | 29.579 | 29.691 |
| 97.8337671997025 | -2.38 | -0.416 | 29.723 | 29.838 |
| 98.00111565637785 | -2.448 | -0.315 | 30.178 | 30.297 |
| 98.16846411305319 | -2.403 | -0.451 | 30.284 | 30.399 |
| 98.33581256972855 | -2.408 | -0.472 | 30.335 | 30.449 |
| 98.50316102640389 | -2.408 | -0.488 | 30.347 | 30.461 |
| 98.67050948307921 | -2.348 | -0.529 | 30.316 | 30.428 |
| 98.83785793975456 | -2.396 | -0.481 | 30.114 | 30.23 |
| 99.0052063964299 | -2.378 | -0.512 | 29.806 | 29.922 |
| 99.17255485310525 | -2.386 | -0.502 | 29.685 | 29.802 |
| 99.33060617329863 | -2.402 | -0.49 | 29.659 | 29.776 |
| 99.49795462997399 | -2.386 | -0.514 | 29.565 | 29.681 |
| 99.66530308664933 | -2.393 | -0.494 | 29.399 | 29.516 |
| 99.83265154332467 | -2.443 | -0.439 | 29.435 | 29.556 |
| 100.0 | -2.499 | -0.397 | 29.589 | 29.713 |